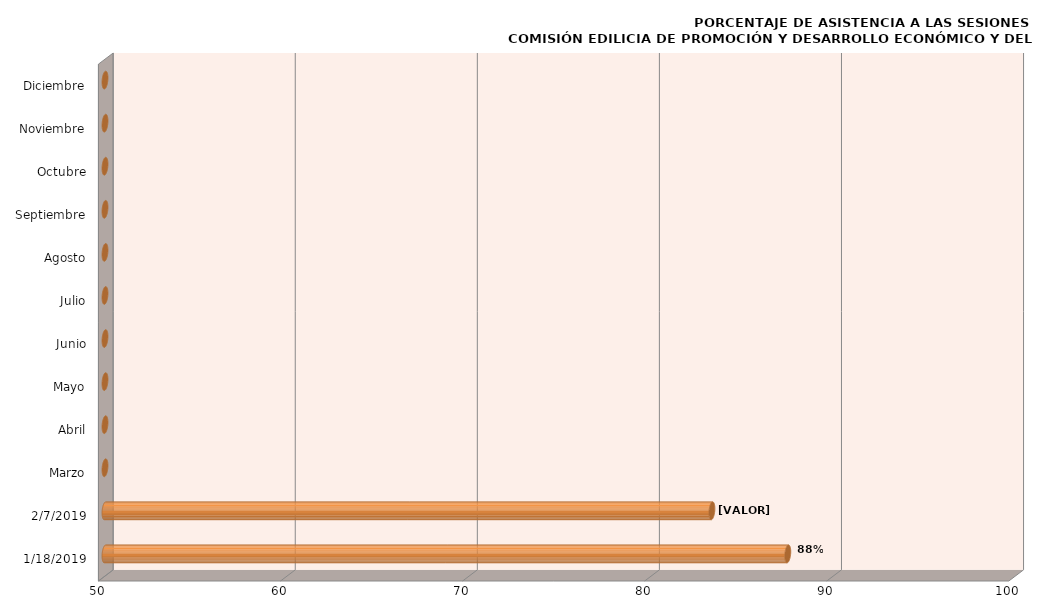
| Category | Series 0 |
|---|---|
| 18/01/2019 | 87.5 |
| 07/02/2019 | 83.333 |
| Marzo | 0 |
| Abril | 0 |
| Mayo | 0 |
| Junio | 0 |
| Julio | 0 |
| Agosto | 0 |
| Septiembre | 0 |
| Octubre | 0 |
| Noviembre | 0 |
| Diciembre | 0 |